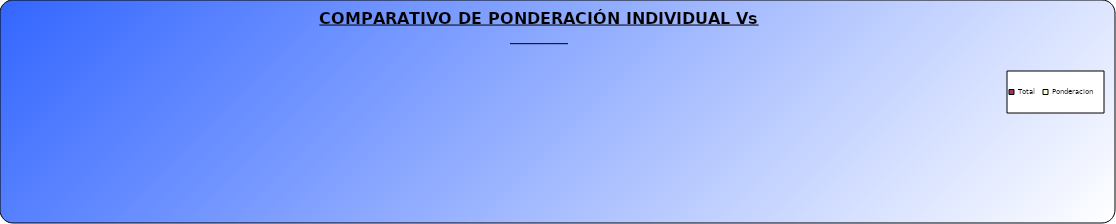
| Category | Total | Ponderacion |
|---|---|---|
| 0 | 8 | 8.435 |
| 1 | 8 | 8.333 |
| 2 | 7 | 28 |
| 3 | 7 | 7 |
| 4 | 7 | 7 |
| 5 | 4 | 4 |
| 6 | 6 | 9.6 |
| 7 | 6 | 6 |
| 8 | 4 | 4 |
| 9 | 7 | 6.3 |
| 10 | 6 | 7.02 |
| 11 | 3 | 3 |
| 12 | 3 | 3 |
| 13 | 6 | 6 |
| 14 | 6 | 6 |
| 15 | 6 | 6 |
| 16 | 6 | 6 |